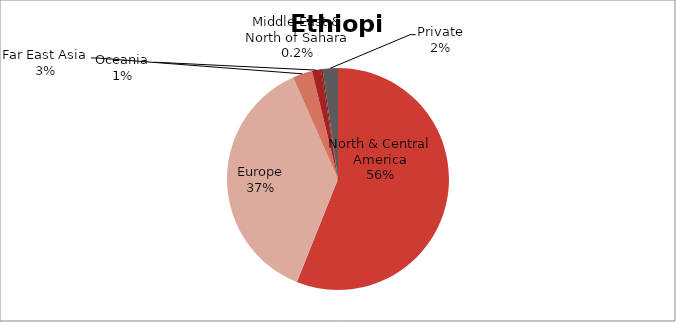
| Category | US$ millions |
|---|---|
| North & Central America | 675.155 |
| Europe | 449.936 |
| Far East Asia | 34.237 |
| Oceania | 15.688 |
| Middle East & North of Sahara | 2.933 |
| Private | 26.77 |